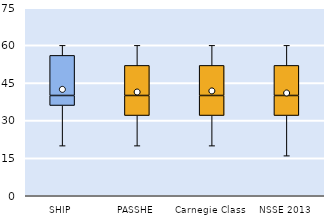
| Category | 25th | 50th | 75th |
|---|---|---|---|
| SHIP | 36 | 4 | 16 |
| PASSHE | 32 | 8 | 12 |
| Carnegie Class | 32 | 8 | 12 |
| NSSE 2013 | 32 | 8 | 12 |